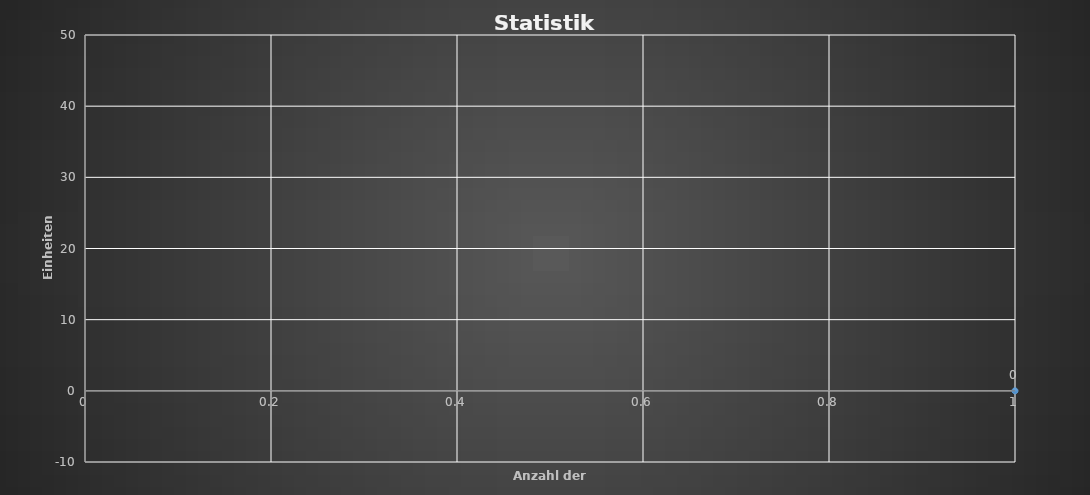
| Category | Series 0 |
|---|---|
| 0 | 0 |
| 1 | -1.5 |
| 2 | 0.075 |
| 3 | 1.827 |
| 4 | 1.802 |
| 5 | 3.822 |
| 6 | 5.372 |
| 7 | 4.372 |
| 8 | 5.272 |
| 9 | 3.772 |
| 10 | 4.957 |
| 11 | 6.147 |
| 12 | 7.747 |
| 13 | 6.747 |
| 14 | 3.747 |
| 15 | 6.349 |
| 16 | 7.107 |
| 17 | 5.607 |
| 18 | 6.607 |
| 19 | 7.567 |
| 20 | 9.654 |
| 21 | 11.454 |
| 22 | 13.409 |
| 23 | 13.409 |
| 24 | 15.829 |
| 25 | 14.329 |
| 26 | 12.829 |
| 27 | 13.999 |
| 28 | 15.274 |
| 29 | 13.774 |
| 30 | 14.379 |
| 31 | 15.989 |
| 32 | 18.779 |
| 33 | 20.389 |
| 34 | 19.289 |
| 35 | 22.091 |
| 36 | 23.311 |
| 37 | 19.311 |
| 38 | 21.961 |
| 39 | 21.461 |
| 40 | 24.881 |
| 41 | 27.154 |
| 42 | 29.711 |
| 43 | 28.711 |
| 44 | 27.211 |
| 45 | 25.211 |
| 46 | 24.711 |
| 47 | 26.55 |
| 48 | 24.55 |
| 49 | 21.55 |
| 50 | 23.095 |
| 51 | 27.095 |
| 52 | 28.765 |
| 53 | 30.365 |
| 54 | 28.365 |
| 55 | 29.426 |
| 56 | 30.856 |
| 57 | 35.112 |
| 58 | 36.499 |
| 59 | 35.499 |
| 60 | 33.999 |
| 61 | 31.999 |
| 62 | 35.412 |
| 63 | 36.668 |
| 64 | 35.168 |
| 65 | 33.168 |
| 66 | 31.668 |
| 67 | 31.168 |
| 68 | 32.098 |
| 69 | 34.786 |
| 70 | 33.786 |
| 71 | 32.786 |
| 72 | 34.661 |
| 73 | 33.661 |
| 74 | 34.996 |
| 75 | 32.496 |
| 76 | 32.496 |
| 77 | 29.496 |
| 78 | 27.996 |
| 79 | 30.196 |
| 80 | 29.696 |
| 81 | 27.696 |
| 82 | 28.795 |
| 83 | 27.795 |
| 84 | 26.795 |
| 85 | 27.819 |
| 86 | 27.319 |
| 87 | 28.669 |
| 88 | 29.885 |
| 89 | 31.015 |
| 90 | 35.845 |
| 91 | 38.071 |
| 92 | 39.566 |
| 93 | 42.128 |
| 94 | 41.128 |
| 95 | 41.418 |
| 96 | 42.843 |
| 97 | 42.343 |
| 98 | 40.843 |
| 99 | 39.843 |
| 100 | 37.843 |
| 101 | 36.343 |
| 102 | 34.843 |
| 103 | 33.843 |
| 104 | 32.843 |
| 105 | 31.343 |
| 106 | 29.843 |
| 107 | 31.336 |
| 108 | 30.836 |